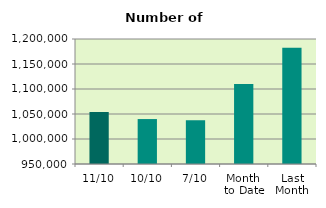
| Category | Series 0 |
|---|---|
| 11/10 | 1053792 |
| 10/10 | 1039886 |
| 7/10 | 1037322 |
| Month 
to Date | 1110140 |
| Last
Month | 1182612.273 |